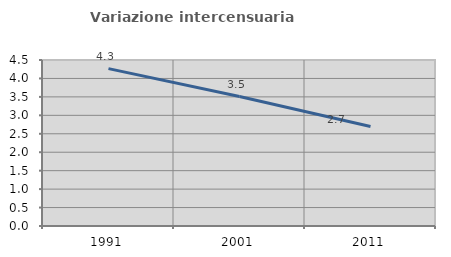
| Category | Variazione intercensuaria annua |
|---|---|
| 1991.0 | 4.266 |
| 2001.0 | 3.509 |
| 2011.0 | 2.696 |